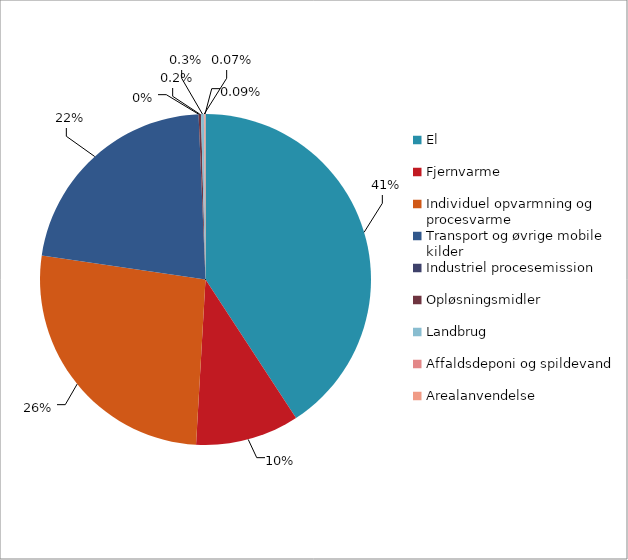
| Category | Series 0 |
|---|---|
| El | 128930.55 |
| Fjernvarme | 32011.885 |
| Individuel opvarmning og procesvarme | 83510.647 |
| Transport og øvrige mobile kilder | 69561.158 |
| Industriel procesemission | 0 |
| Opløsningsmidler | 730 |
| Landbrug | 884 |
| Affaldsdeponi og spildevand | 218 |
| Arealanvendelse | 278 |